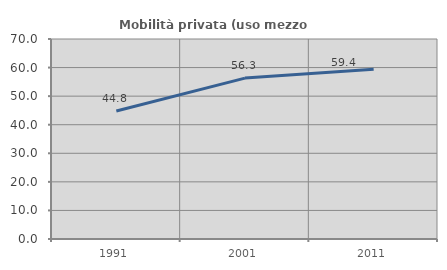
| Category | Mobilità privata (uso mezzo privato) |
|---|---|
| 1991.0 | 44.816 |
| 2001.0 | 56.312 |
| 2011.0 | 59.384 |